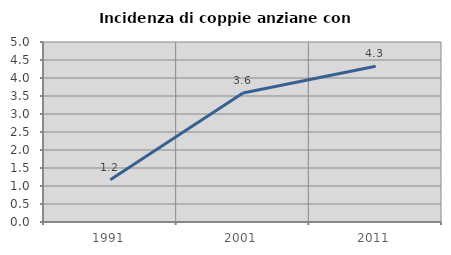
| Category | Incidenza di coppie anziane con figli |
|---|---|
| 1991.0 | 1.174 |
| 2001.0 | 3.584 |
| 2011.0 | 4.325 |